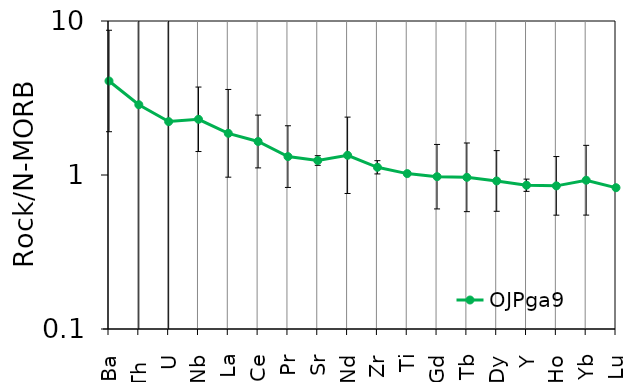
| Category | OJPga9 |
|---|---|
| Ba | 4.078 |
| Th  | 2.86 |
| U | 2.223 |
| Nb | 2.3 |
| La | 1.865 |
| Ce | 1.65 |
| Pr | 1.317 |
| Sr | 1.242 |
| Nd | 1.342 |
| Zr | 1.122 |
| Ti | 1.021 |
| Gd | 0.975 |
| Tb | 0.966 |
| Dy | 0.915 |
| Y | 0.858 |
| Ho | 0.85 |
| Yb | 0.925 |
| Lu | 0.827 |